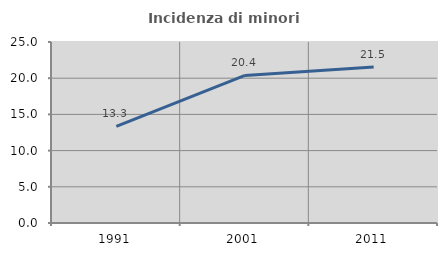
| Category | Incidenza di minori stranieri |
|---|---|
| 1991.0 | 13.333 |
| 2001.0 | 20.39 |
| 2011.0 | 21.536 |